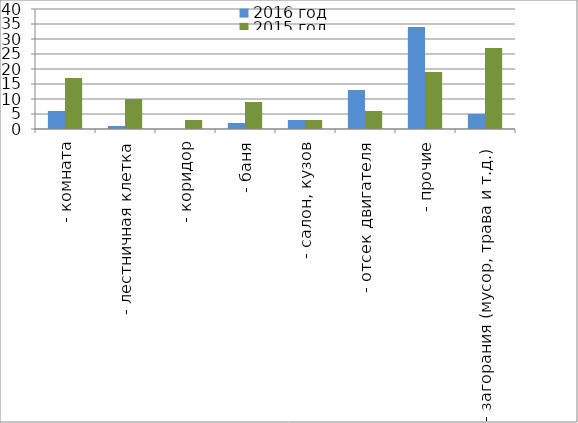
| Category | 2016 год | 2015 год |
|---|---|---|
|  - комната | 6 | 17 |
|  - лестничная клетка | 1 | 10 |
|  - коридор | 0 | 3 |
|  - баня | 2 | 9 |
|  - салон, кузов | 3 | 3 |
|  - отсек двигателя | 13 | 6 |
| - прочие | 34 | 19 |
| - загорания (мусор, трава и т.д.)  | 5 | 27 |